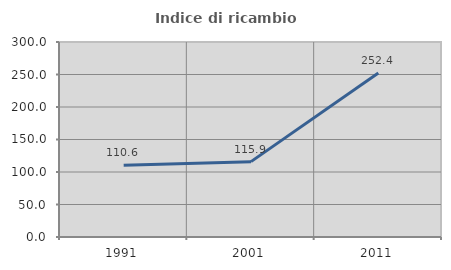
| Category | Indice di ricambio occupazionale  |
|---|---|
| 1991.0 | 110.556 |
| 2001.0 | 115.934 |
| 2011.0 | 252.381 |